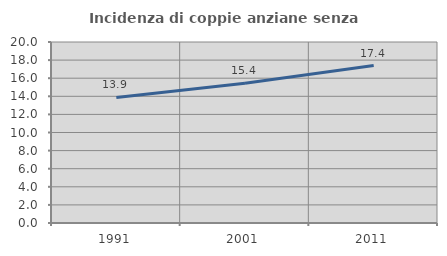
| Category | Incidenza di coppie anziane senza figli  |
|---|---|
| 1991.0 | 13.879 |
| 2001.0 | 15.446 |
| 2011.0 | 17.391 |